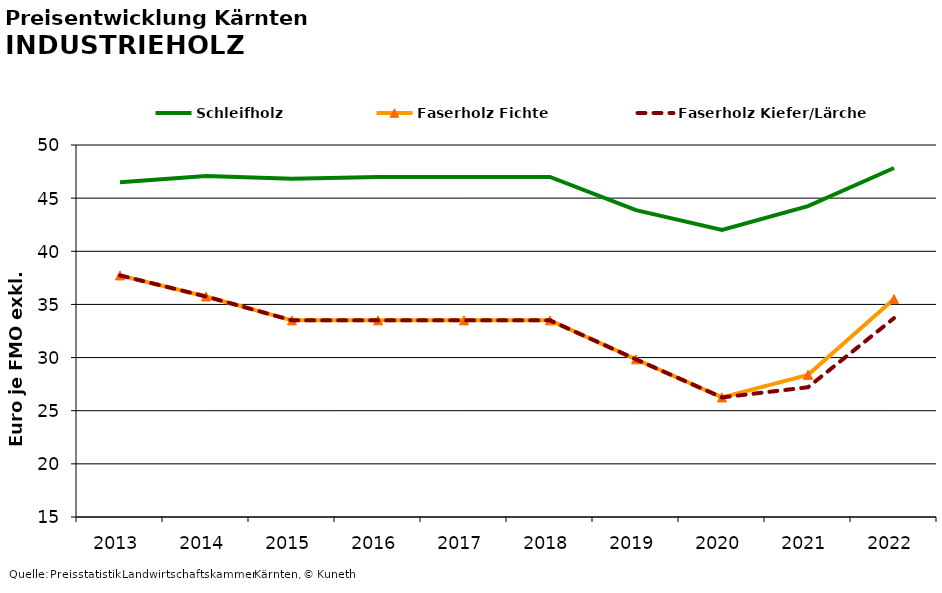
| Category | Schleifholz | Faserholz Fichte | Faserholz Kiefer/Lärche |
|---|---|---|---|
| 2013.0 | 46.5 | 37.729 | 37.729 |
| 2014.0 | 47.083 | 35.75 | 35.75 |
| 2015.0 | 46.833 | 33.5 | 33.5 |
| 2016.0 | 47 | 33.5 | 33.5 |
| 2017.0 | 47 | 33.5 | 33.5 |
| 2018.0 | 47 | 33.5 | 33.5 |
| 2019.0 | 43.875 | 29.833 | 29.833 |
| 2020.0 | 42 | 26.25 | 26.25 |
| 2021.0 | 44.25 | 28.375 | 27.208 |
| 2022.0 | 47.833 | 35.5 | 33.708 |